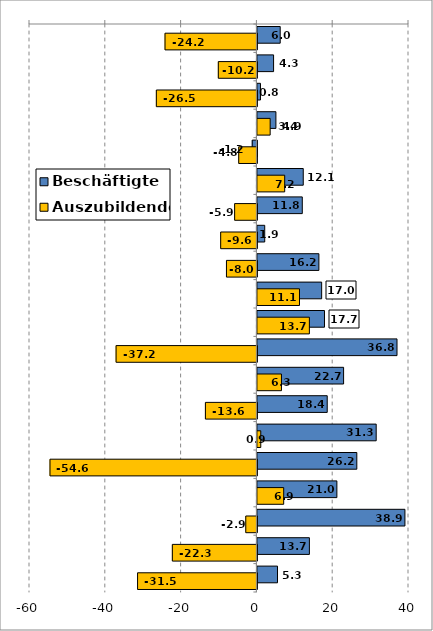
| Category | Beschäftigte | Auszubildende |
|---|---|---|
| 0 | 6.019 | -24.242 |
| 1 | 4.272 | -10.18 |
| 2 | 0.813 | -26.53 |
| 3 | 4.884 | 3.368 |
| 4 | -1.227 | -4.799 |
| 5 | 12.101 | 7.2 |
| 6 | 11.845 | -5.875 |
| 7 | 1.935 | -9.558 |
| 8 | 16.227 | -8.03 |
| 9 | 16.956 | 11.104 |
| 10 | 17.703 | 13.715 |
| 11 | 36.835 | -37.156 |
| 12 | 22.743 | 6.347 |
| 13 | 18.423 | -13.583 |
| 14 | 31.345 | 0.889 |
| 15 | 26.234 | -54.593 |
| 16 | 20.97 | 6.937 |
| 17 | 38.927 | -2.937 |
| 18 | 13.718 | -22.309 |
| 19 | 5.306 | -31.485 |